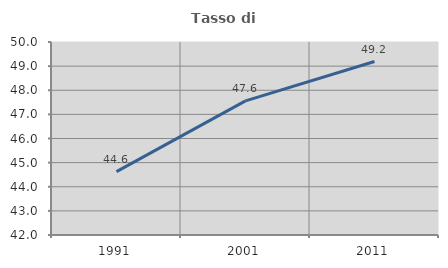
| Category | Tasso di occupazione   |
|---|---|
| 1991.0 | 44.626 |
| 2001.0 | 47.56 |
| 2011.0 | 49.19 |